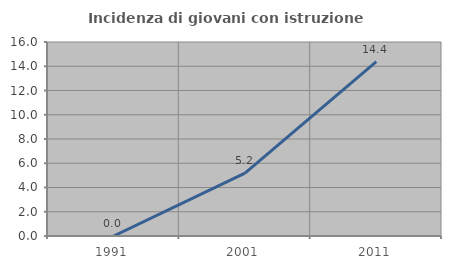
| Category | Incidenza di giovani con istruzione universitaria |
|---|---|
| 1991.0 | 0 |
| 2001.0 | 5.185 |
| 2011.0 | 14.388 |